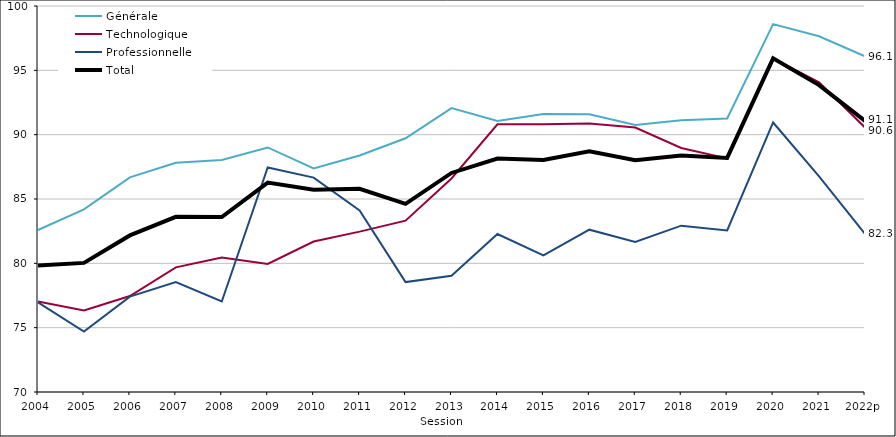
| Category | Générale | Technologique | Professionnelle | Total |
|---|---|---|---|---|
| 2004 | 82.591 | 77.039 | 76.965 | 79.839 |
| 2005 | 84.193 | 76.33 | 74.701 | 80.034 |
| 2006 | 86.68 | 77.457 | 77.412 | 82.17 |
| 2007 | 87.822 | 79.686 | 78.547 | 83.612 |
| 2008 | 88.033 | 80.448 | 77.034 | 83.597 |
| 2009 | 89.007 | 79.947 | 87.445 | 86.275 |
| 2010 | 87.37 | 81.696 | 86.666 | 85.721 |
| 2011 | 88.386 | 82.466 | 84.115 | 85.793 |
| 2012 | 89.717 | 83.319 | 78.543 | 84.62 |
| 2013 | 92.061 | 86.592 | 79.029 | 87.024 |
| 2014 | 91.06 | 90.805 | 82.279 | 88.144 |
| 2015 | 91.598 | 90.808 | 80.617 | 88.024 |
| 2016 | 91.588 | 90.875 | 82.616 | 88.716 |
| 2017 | 90.747 | 90.555 | 81.662 | 88.011 |
| 2018 | 91.128 | 88.966 | 82.928 | 88.376 |
| 2019 | 91.253 | 88.152 | 82.551 | 88.196 |
| 2020 | 98.592 | 95.925 | 90.947 | 95.929 |
| 2021 | 97.647 | 94.077 | 86.76 | 93.852 |
| 2022p | 96.092 | 90.56 | 82.288 | 91.072 |